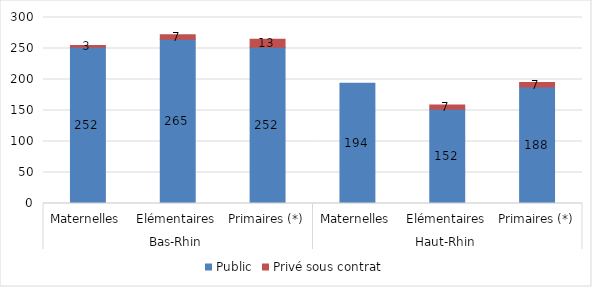
| Category | Public | Privé sous contrat |
|---|---|---|
| 0 | 252 | 3 |
| 1 | 265 | 7 |
| 2 | 252 | 13 |
| 3 | 194 | 0 |
| 4 | 152 | 7 |
| 5 | 188 | 7 |